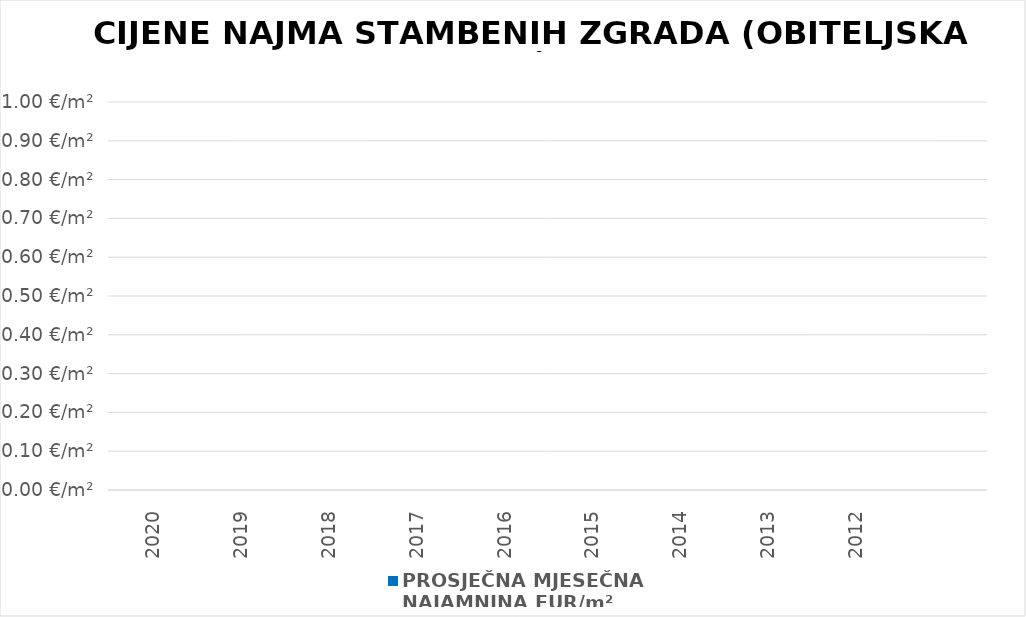
| Category | PROSJEČNA MJESEČNA 
NAJAMNINA EUR/m² |
|---|---|
| 2020 | 0 |
| 2019 | 0 |
| 2018 | 0 |
| 2017 | 0 |
| 2016 | 0 |
| 2015 | 0 |
| 2014 | 0 |
| 2013 | 0 |
| 2012 | 0 |